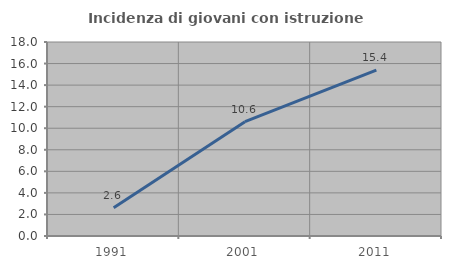
| Category | Incidenza di giovani con istruzione universitaria |
|---|---|
| 1991.0 | 2.632 |
| 2001.0 | 10.606 |
| 2011.0 | 15.385 |